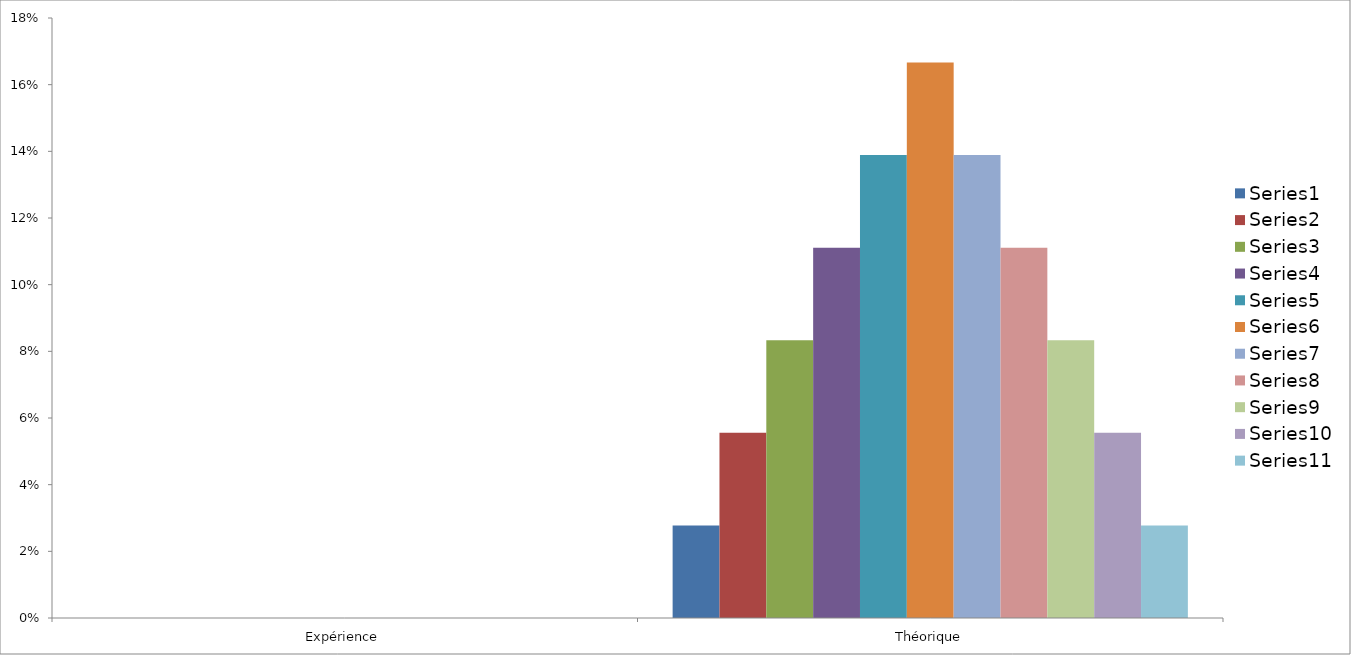
| Category | Series 0 | Series 1 | Series 2 | Series 3 | Series 4 | Series 5 | Series 6 | Series 7 | Series 8 | Series 9 | Series 10 |
|---|---|---|---|---|---|---|---|---|---|---|---|
| Expérience | 0 | 0 | 0 | 0 | 0 | 0 | 0 | 0 | 0 | 0 | 0 |
| Théorique | 0.028 | 0.056 | 0.083 | 0.111 | 0.139 | 0.167 | 0.139 | 0.111 | 0.083 | 0.056 | 0.028 |